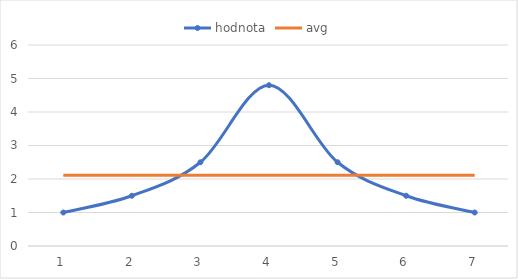
| Category | hodnota | avg |
|---|---|---|
| 0 | 1 | 2.114 |
| 1 | 1.5 | 2.114 |
| 2 | 2.5 | 2.114 |
| 3 | 4.8 | 2.114 |
| 4 | 2.5 | 2.114 |
| 5 | 1.5 | 2.114 |
| 6 | 1 | 2.114 |